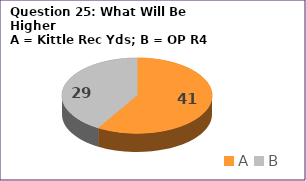
| Category | Series 0 |
|---|---|
| A | 41 |
| B | 29 |